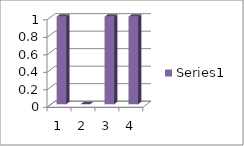
| Category | Series 0 |
|---|---|
| 0 | 1 |
| 1 | 0 |
| 2 | 1 |
| 3 | 1 |